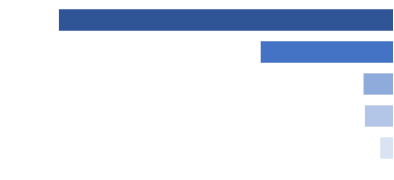
| Category | Series 0 |
|---|---|
| 0 | 42500 |
| 1 | 98000 |
| 2 | 103000 |
| 3 | 475000 |
| 4 | 1205000 |